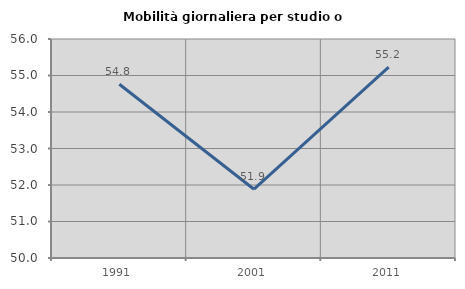
| Category | Mobilità giornaliera per studio o lavoro |
|---|---|
| 1991.0 | 54.759 |
| 2001.0 | 51.885 |
| 2011.0 | 55.23 |